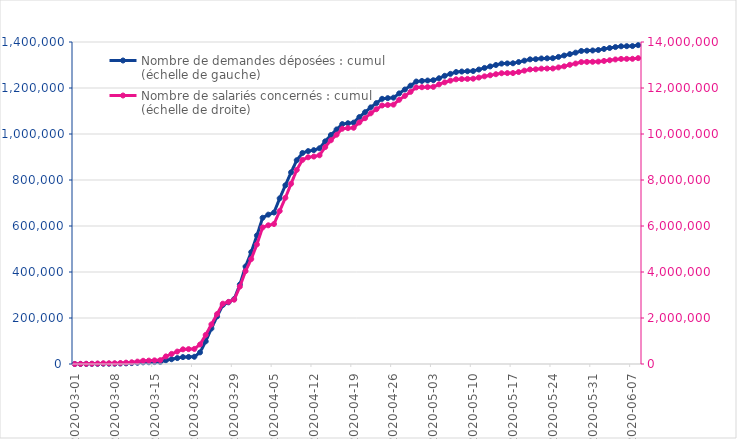
| Category | Nombre de demandes déposées : cumul (échelle de gauche) |
|---|---|
| 2020-03-01 | 1 |
| 2020-03-02 | 125 |
| 2020-03-03 | 290 |
| 2020-03-04 | 492 |
| 2020-03-05 | 797 |
| 2020-03-06 | 1275 |
| 2020-03-07 | 1300 |
| 2020-03-08 | 1317 |
| 2020-03-09 | 1950 |
| 2020-03-10 | 2801 |
| 2020-03-11 | 3913 |
| 2020-03-12 | 5465 |
| 2020-03-13 | 7244 |
| 2020-03-14 | 7710 |
| 2020-03-15 | 8360 |
| 2020-03-16 | 8685 |
| 2020-03-17 | 16166 |
| 2020-03-18 | 20714 |
| 2020-03-19 | 25749 |
| 2020-03-20 | 29988 |
| 2020-03-21 | 30637 |
| 2020-03-22 | 31451 |
| 2020-03-23 | 50434 |
| 2020-03-24 | 98588 |
| 2020-03-25 | 154417 |
| 2020-03-26 | 207171 |
| 2020-03-27 | 256534 |
| 2020-03-28 | 268148 |
| 2020-03-29 | 282308 |
| 2020-03-30 | 345482 |
| 2020-03-31 | 424034 |
| 2020-04-01 | 486442 |
| 2020-04-02 | 558879 |
| 2020-04-03 | 635694 |
| 2020-04-04 | 649373 |
| 2020-04-05 | 658566 |
| 2020-04-06 | 720176 |
| 2020-04-07 | 777002 |
| 2020-04-08 | 833251 |
| 2020-04-09 | 885948 |
| 2020-04-10 | 917401 |
| 2020-04-11 | 925599 |
| 2020-04-12 | 929782 |
| 2020-04-13 | 937987 |
| 2020-04-14 | 968058 |
| 2020-04-15 | 995510 |
| 2020-04-16 | 1019757 |
| 2020-04-17 | 1043063 |
| 2020-04-18 | 1046718 |
| 2020-04-19 | 1049445 |
| 2020-04-20 | 1073617 |
| 2020-04-21 | 1094640 |
| 2020-04-22 | 1115717 |
| 2020-04-23 | 1134451 |
| 2020-04-24 | 1152919 |
| 2020-04-25 | 1155897 |
| 2020-04-26 | 1157886 |
| 2020-04-27 | 1176474 |
| 2020-04-28 | 1193400 |
| 2020-04-29 | 1210179 |
| 2020-04-30 | 1228062 |
| 2020-05-01 | 1230675 |
| 2020-05-02 | 1232426 |
| 2020-05-03 | 1233828 |
| 2020-05-04 | 1242302 |
| 2020-05-05 | 1252995 |
| 2020-05-06 | 1261415 |
| 2020-05-07 | 1269399 |
| 2020-05-08 | 1271598 |
| 2020-05-09 | 1272903 |
| 2020-05-10 | 1273769 |
| 2020-05-11 | 1280203 |
| 2020-05-12 | 1287231 |
| 2020-05-13 | 1293870 |
| 2020-05-14 | 1299953 |
| 2020-05-15 | 1306076 |
| 2020-05-16 | 1306880 |
| 2020-05-17 | 1307457 |
| 2020-05-18 | 1312893 |
| 2020-05-19 | 1318810 |
| 2020-05-20 | 1324534 |
| 2020-05-21 | 1325403 |
| 2020-05-22 | 1328349 |
| 2020-05-23 | 1329041 |
| 2020-05-24 | 1329562 |
| 2020-05-25 | 1335075 |
| 2020-05-26 | 1341303 |
| 2020-05-27 | 1347300 |
| 2020-05-28 | 1353675 |
| 2020-05-29 | 1361038 |
| 2020-05-30 | 1362165 |
| 2020-05-31 | 1363125 |
| 2020-06-01 | 1365214 |
| 2020-06-02 | 1369842 |
| 2020-06-03 | 1373908 |
| 2020-06-04 | 1377915 |
| 2020-06-05 | 1381282 |
| 2020-06-06 | 1381833 |
| 2020-06-07 | 1382342 |
| 2020-06-08 | 1386346 |